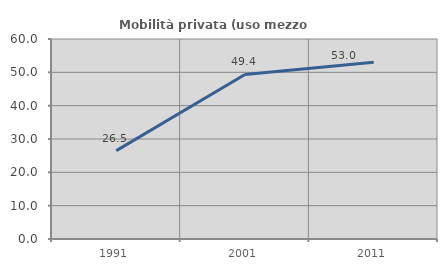
| Category | Mobilità privata (uso mezzo privato) |
|---|---|
| 1991.0 | 26.505 |
| 2001.0 | 49.355 |
| 2011.0 | 53.01 |